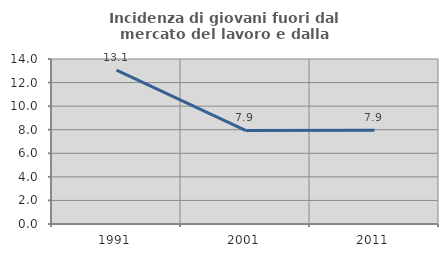
| Category | Incidenza di giovani fuori dal mercato del lavoro e dalla formazione  |
|---|---|
| 1991.0 | 13.054 |
| 2001.0 | 7.937 |
| 2011.0 | 7.947 |